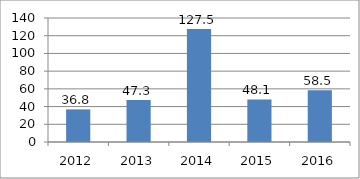
| Category | Series 0 |
|---|---|
| 2012.0 | 36.8 |
| 2013.0 | 47.3 |
| 2014.0 | 127.5 |
| 2015.0 | 48.1 |
| 2016.0 | 58.5 |